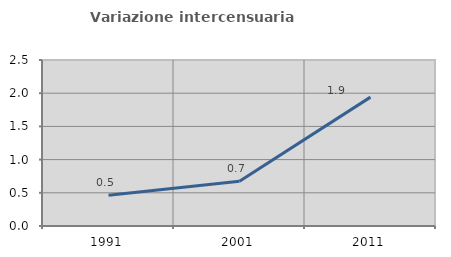
| Category | Variazione intercensuaria annua |
|---|---|
| 1991.0 | 0.463 |
| 2001.0 | 0.675 |
| 2011.0 | 1.941 |